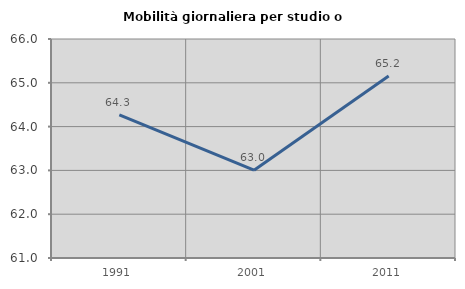
| Category | Mobilità giornaliera per studio o lavoro |
|---|---|
| 1991.0 | 64.266 |
| 2001.0 | 63.006 |
| 2011.0 | 65.155 |